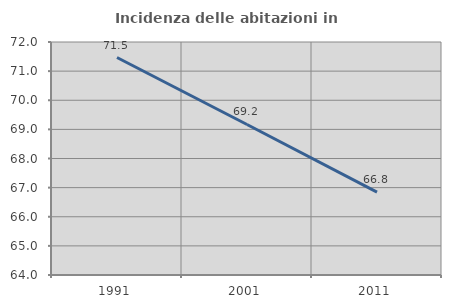
| Category | Incidenza delle abitazioni in proprietà  |
|---|---|
| 1991.0 | 71.467 |
| 2001.0 | 69.168 |
| 2011.0 | 66.848 |